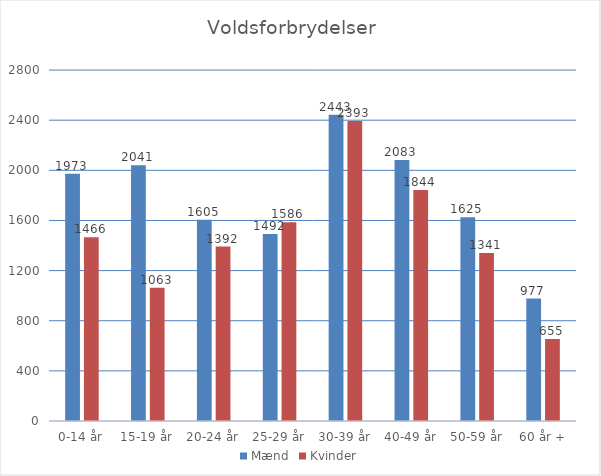
| Category | Mænd | Kvinder |
|---|---|---|
| 0-14 år | 1973 | 1466 |
| 15-19 år | 2041 | 1063 |
| 20-24 år | 1605 | 1392 |
| 25-29 år | 1492 | 1586 |
| 30-39 år | 2443 | 2393 |
| 40-49 år | 2083 | 1844 |
| 50-59 år | 1625 | 1341 |
| 60 år + | 977 | 655 |